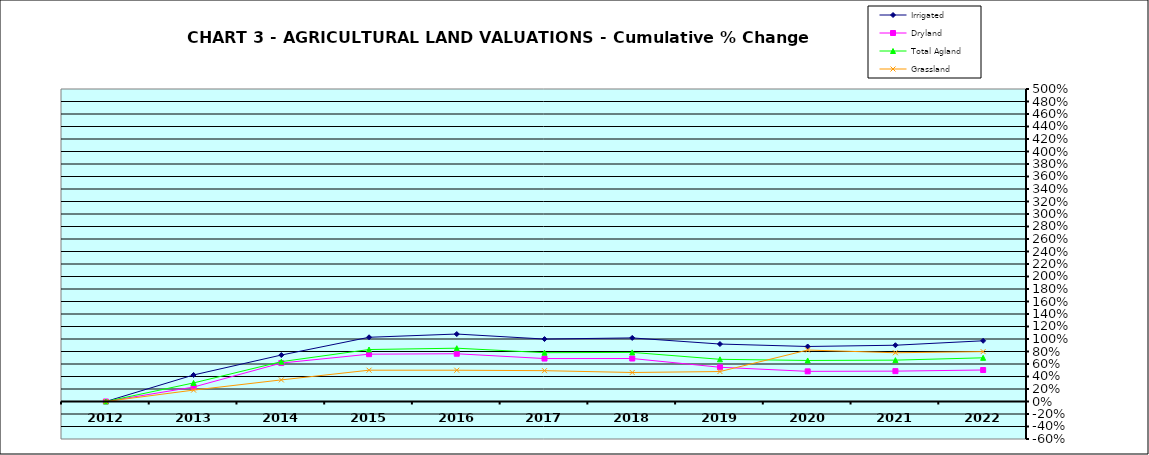
| Category | Irrigated | Dryland | Total Agland | Grassland |
|---|---|---|---|---|
| 2012.0 | 0 | 0 | 0 | 0 |
| 2013.0 | 0.425 | 0.231 | 0.297 | 0.182 |
| 2014.0 | 0.743 | 0.615 | 0.637 | 0.346 |
| 2015.0 | 1.028 | 0.757 | 0.832 | 0.501 |
| 2016.0 | 1.079 | 0.764 | 0.853 | 0.5 |
| 2017.0 | 0.999 | 0.687 | 0.781 | 0.493 |
| 2018.0 | 1.017 | 0.688 | 0.786 | 0.464 |
| 2019.0 | 0.919 | 0.548 | 0.675 | 0.479 |
| 2020.0 | 0.88 | 0.482 | 0.656 | 0.823 |
| 2021.0 | 0.9 | 0.486 | 0.662 | 0.78 |
| 2022.0 | 0.971 | 0.504 | 0.699 | 0.798 |